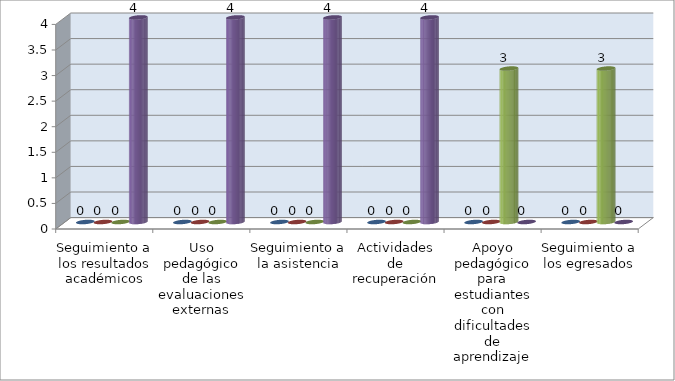
| Category | Series 0 | Series 1 | Series 2 | Series 3 |
|---|---|---|---|---|
| Seguimiento a los resultados
académicos | 0 | 0 | 0 | 4 |
| Uso pedagógico de las
evaluaciones externas | 0 | 0 | 0 | 4 |
| Seguimiento a la asistencia | 0 | 0 | 0 | 4 |
| Actividades de recuperación | 0 | 0 | 0 | 4 |
| Apoyo pedagógico para
estudiantes con dificultades de
aprendizaje | 0 | 0 | 3 | 0 |
| Seguimiento a los egresados | 0 | 0 | 3 | 0 |